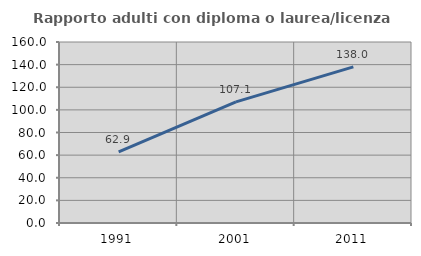
| Category | Rapporto adulti con diploma o laurea/licenza media  |
|---|---|
| 1991.0 | 62.943 |
| 2001.0 | 107.062 |
| 2011.0 | 137.967 |